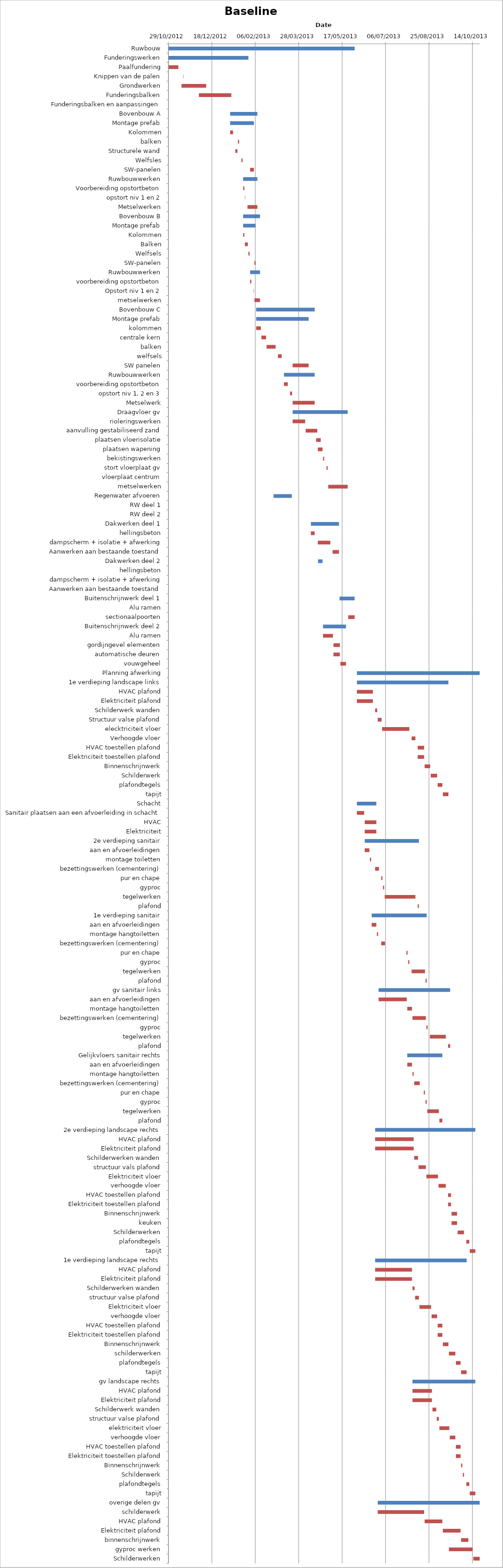
| Category | Baseline start | Actual duration |
|---|---|---|
| Ruwbouw | 41211.333 | 214.375 |
| Funderingswerken | 41211.333 | 92.042 |
| Paalfundering | 41211.333 | 11.375 |
| Knippen van de palen | 41228.333 | 0.375 |
| Grondwerken | 41226.333 | 28.375 |
| Funderingsbalken | 41246.333 | 37.375 |
| Funderingsbalken en aanpassingen | 41303.333 | 0.042 |
| Bovenbouw A | 41282.333 | 31.375 |
| Montage prefab | 41282.333 | 27.375 |
| Kolommen | 41282.333 | 3.375 |
| balken | 41291.333 | 1.375 |
| Structurele wand | 41288.333 | 2.375 |
| Welfsles | 41295.333 | 1.375 |
| SW-panelen | 41305.333 | 4.375 |
| Ruwbouwwerken | 41297.333 | 16.375 |
| Voorbereiding opstortbeton | 41297.333 | 1.375 |
| opstort niv 1 en 2 | 41299.333 | 0.375 |
| Metselwerken | 41302.333 | 11.375 |
| Bovenbouw B | 41297.333 | 19.375 |
| Montage prefab | 41297.333 | 14.375 |
| Kolommen | 41297.333 | 1.375 |
| Balken | 41299.333 | 3.375 |
| Welfsels | 41303.333 | 1.375 |
| SW-panelen | 41310.333 | 1.375 |
| Ruwbouwwerken | 41305.333 | 11.375 |
| voorbereiding opstortbeton | 41305.333 | 1.375 |
| Opstort niv 1 en 2 | 41309.333 | 0.375 |
| metselwerken | 41310.333 | 6.375 |
| Bovenbouw C | 41312.333 | 67.375 |
| Montage prefab | 41312.333 | 60.375 |
| kolommen | 41312.333 | 5.375 |
| centrale kern | 41318.333 | 5.375 |
| balken | 41324.333 | 10.375 |
| welfsels | 41337.333 | 4.375 |
| SW panelen | 41354.333 | 18.375 |
| Ruwbouwwerken | 41344.333 | 35.375 |
| voorbereiding opstortbeton | 41344.333 | 4.375 |
| opstort niv 1, 2 en 3 | 41351.333 | 2.375 |
| Metselwerk | 41354.333 | 25.375 |
| Draagvloer gv | 41354.333 | 63.375 |
| rioleringswerken | 41354.333 | 14.375 |
| aanvulling gestabiliseerd zand | 41369.333 | 13.375 |
| plaatsen vloerisolatie | 41381.333 | 5.375 |
| plaatsen wapening | 41383.333 | 5.375 |
| bekistingswerken | 41389.333 | 1.375 |
| stort vloerplaat gv | 41393.333 | 1.375 |
| vloerplaat centrum | 41396.333 | 0.042 |
| metselwerken | 41395.333 | 22.375 |
| Regenwater afvoeren | 41332.333 | 21.042 |
| RW deel 1 | 41332.333 | 0.042 |
| RW deel 2 | 41353.333 | 0.042 |
| Dakwerken deel 1 | 41375.333 | 32.375 |
| hellingsbeton | 41375.333 | 4.375 |
| dampscherm + isolatie + afwerking | 41383.333 | 14.375 |
| Aanwerken aan bestaande toestand | 41400.333 | 7.375 |
| Dakwerken deel 2 | 41383.583 | 5.125 |
| hellingsbeton | 41383.583 | 0.042 |
| dampscherm + isolatie + afwerking | 41388.625 | 0.042 |
| Aanwerken aan bestaande toestand | 41388.667 | 0.042 |
| Buitenschrijnwerk deel 1 | 41408.333 | 17.375 |
| Alu ramen | 41408.333 | 0.042 |
| sectionaalpoorten | 41418.333 | 7.375 |
| Buitenschrijnwerk deel 2 | 41389.333 | 26.375 |
| Alu ramen | 41389.333 | 11.375 |
| gordijngevel elementen | 41401.333 | 7.375 |
| automatische deuren | 41401.333 | 7.375 |
| vouwgeheel | 41409.333 | 6.375 |
| Planning afwerking | 41428.333 | 141.375 |
| 1e verdieping landscape links | 41428.333 | 105.375 |
| HVAC plafond | 41428.333 | 18.375 |
| Elektriciteit plafond | 41428.333 | 18.375 |
| Schilderwerk wanden | 41449.333 | 2.375 |
| Structuur valse plafond | 41452.333 | 4.375 |
| elecktriciteit vloer | 41457.333 | 31.375 |
| Verhoogde vloer | 41491.333 | 4.375 |
| HVAC toestellen plafond | 41498.333 | 7.375 |
| Elektriciteit toestellen plafond | 41498.333 | 7.375 |
| Binnenschrijnwerk | 41506.333 | 6.375 |
| Schilderwerk | 41513.333 | 7.375 |
| plafondtegels | 41521.333 | 5.375 |
| tapijt | 41527.333 | 6.375 |
| Schacht | 41428.333 | 22.375 |
| Sanitair plaatsen aan een afvoerleiding in schacht | 41428.333 | 8.375 |
| HVAC | 41437.333 | 13.375 |
| Elektriciteit | 41437.333 | 13.375 |
| 2e verdieping sanitair | 41437.333 | 62.375 |
| aan en afvoerleidingen | 41437.333 | 5.375 |
| montage toiletten | 41443.333 | 1.375 |
| bezettingswerken (cementering) | 41449.333 | 4.375 |
| pur en chape | 41456.333 | 1.375 |
| gyproc | 41458.333 | 1.375 |
| tegelwerken | 41460.333 | 35.375 |
| plafond | 41498.333 | 1.375 |
| 1e verdieping sanitair | 41445.333 | 63.375 |
| aan en afvoerleidingen | 41445.333 | 5.375 |
| montage hangtoiletten | 41451.333 | 1.375 |
| bezettingswerken (cementering) | 41456.333 | 4.375 |
| pur en chape | 41485.333 | 1.375 |
| gyproc | 41487.333 | 1.375 |
| tegelwerken | 41491.333 | 15.375 |
| plafond | 41507.333 | 1.375 |
| gv sanitair links | 41453.333 | 82.375 |
| aan en afvoerleidingen | 41453.333 | 32.375 |
| montage hangtoiletten | 41486.333 | 5.375 |
| bezettingswerken (cementering) | 41492.333 | 15.375 |
| gyproc | 41508.333 | 1.375 |
| tegelwerken | 41512.333 | 18.375 |
| plafond | 41533.333 | 2.375 |
| Gelijkvloers sanitair rechts | 41486.333 | 40.375 |
| aan en afvoerleidingen | 41486.333 | 5.375 |
| montage hangtoiletten | 41492.333 | 1.375 |
| bezettingswerken (cementering) | 41494.333 | 6.375 |
| pur en chape | 41505.333 | 1.375 |
| gyproc | 41507.333 | 1.375 |
| tegelwerken | 41509.333 | 13.375 |
| plafond | 41523.333 | 3.375 |
| 2e verdieping landscape rechts | 41449.333 | 115.375 |
| HVAC plafond | 41449.333 | 44.375 |
| Elektriciteit plafond | 41449.333 | 44.375 |
| Schilderwerken wanden | 41494.333 | 4.375 |
| structuur vals plafond | 41499.333 | 8.375 |
| Elektriciteit vloer | 41508.333 | 13.375 |
| verhoogde vloer | 41522.333 | 8.375 |
| HVAC toestellen plafond | 41533.333 | 3.375 |
| Elektriciteit toestellen plafond | 41533.333 | 3.375 |
| Binnenschrijnwerk | 41537.333 | 6.375 |
| keuken | 41537.333 | 6.375 |
| Schilderwerken | 41544.333 | 7.375 |
| plafondtegels | 41554.333 | 3.375 |
| tapijt | 41558.333 | 6.375 |
| 1e verdieping landscape rechts | 41449.333 | 105.375 |
| HVAC plafond | 41449.333 | 42.375 |
| Elektriciteit plafond | 41449.333 | 42.375 |
| Schilderwerken wanden | 41492.333 | 2.375 |
| structuur valse plafond | 41495.333 | 4.375 |
| Elektriciteit vloer | 41500.333 | 13.375 |
| verhoogde vloer | 41514.333 | 6.375 |
| HVAC toestellen plafond | 41521.333 | 5.375 |
| Elektriciteit toestellen plafond | 41521.333 | 5.375 |
| Binnenschrijnwerk | 41527.333 | 6.375 |
| schilderwerken | 41534.333 | 7.375 |
| plafondtegels | 41542.333 | 5.375 |
| tapijt | 41548.333 | 6.375 |
| gv landscape rechts | 41492.333 | 72.375 |
| HVAC plafond | 41492.333 | 22.375 |
| Elektriciteit plafond | 41492.333 | 22.375 |
| Schilderwerk wanden | 41515.333 | 4.375 |
| structuur valse plafond | 41520.333 | 2.375 |
| elektriciteit vloer | 41523.333 | 11.375 |
| verhoogde vloer | 41535.333 | 6.375 |
| HVAC toestellen plafond | 41542.333 | 5.375 |
| Elektriciteit toestellen plafond | 41542.333 | 5.375 |
| Binnenschrijnwerk | 41548.333 | 1.375 |
| Schilderwerk | 41550.333 | 1.375 |
| plafondtegels | 41554.333 | 3.375 |
| tapijt | 41558.333 | 6.375 |
| overige delen gv | 41452.333 | 117.375 |
| schilderwerk | 41452.333 | 53.375 |
| HVAC plafond | 41506.333 | 20.375 |
| Elektriciteit plafond | 41527.333 | 20.375 |
| binnenschrijnwerk | 41548.333 | 8.375 |
| gyproc werken | 41534.333 | 27.375 |
| Schilderwerken | 41562.333 | 7.375 |